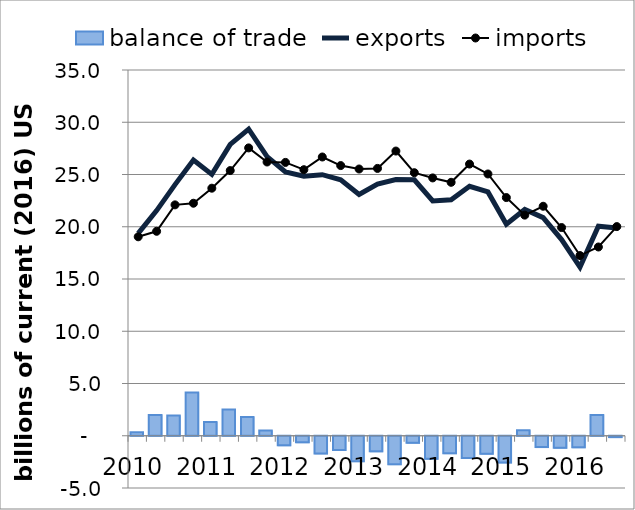
| Category | balance of trade |
|---|---|
| 0 | 0.329 |
| 1 | 1.982 |
| 2 | 1.939 |
| 3 | 4.133 |
| 4 | 1.321 |
| 5 | 2.506 |
| 6 | 1.8 |
| 7 | 0.511 |
| 8 | -0.914 |
| 9 | -0.622 |
| 10 | -1.691 |
| 11 | -1.359 |
| 12 | -2.433 |
| 13 | -1.493 |
| 14 | -2.72 |
| 15 | -0.678 |
| 16 | -2.206 |
| 17 | -1.671 |
| 18 | -2.124 |
| 19 | -1.719 |
| 20 | -2.56 |
| 21 | 0.537 |
| 22 | -1.086 |
| 23 | -1.153 |
| 24 | -1.105 |
| 25 | 1.993 |
| 26 | -0.129 |